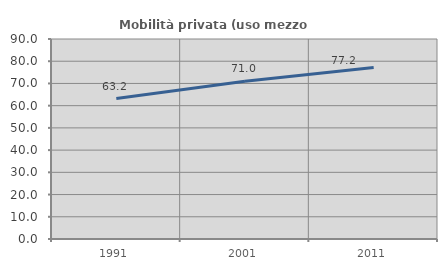
| Category | Mobilità privata (uso mezzo privato) |
|---|---|
| 1991.0 | 63.185 |
| 2001.0 | 71.002 |
| 2011.0 | 77.161 |